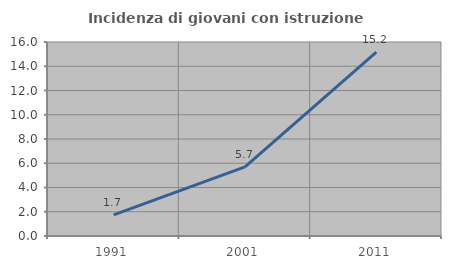
| Category | Incidenza di giovani con istruzione universitaria |
|---|---|
| 1991.0 | 1.741 |
| 2001.0 | 5.7 |
| 2011.0 | 15.174 |